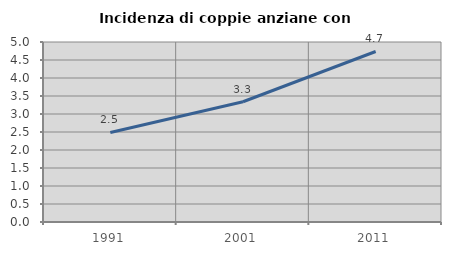
| Category | Incidenza di coppie anziane con figli |
|---|---|
| 1991.0 | 2.487 |
| 2001.0 | 3.34 |
| 2011.0 | 4.737 |